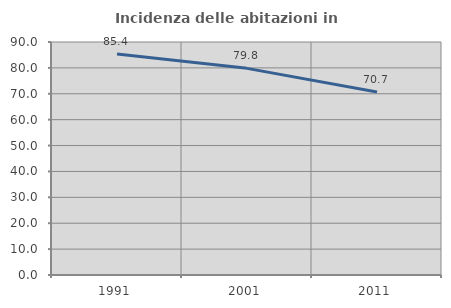
| Category | Incidenza delle abitazioni in proprietà  |
|---|---|
| 1991.0 | 85.397 |
| 2001.0 | 79.817 |
| 2011.0 | 70.679 |